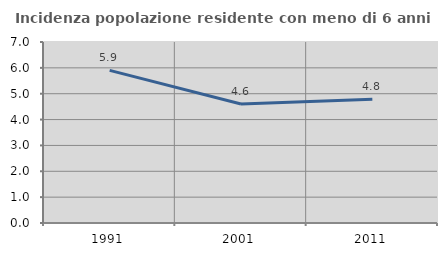
| Category | Incidenza popolazione residente con meno di 6 anni |
|---|---|
| 1991.0 | 5.904 |
| 2001.0 | 4.599 |
| 2011.0 | 4.781 |